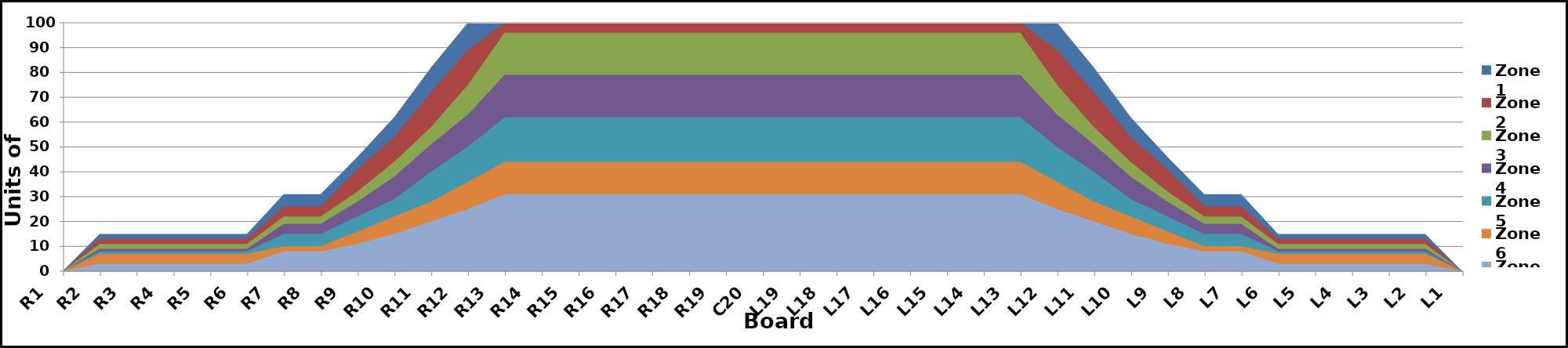
| Category | Zone 1 | Zone 2 | Zone 3 | Zone 4 | Zone 5 | Zone 6 | Zone 7 | Zone 8 |
|---|---|---|---|---|---|---|---|---|
| L1 | 0 | 0 | 0 | 0 | 0 | 0 | 0 | 0 |
| L2 | 15 | 13 | 11 | 9 | 8 | 7 | 3 | 0 |
| L3 | 15 | 13 | 11 | 9 | 8 | 7 | 3 | 0 |
| L4 | 15 | 13 | 11 | 9 | 8 | 7 | 3 | 0 |
| L5 | 15 | 13 | 11 | 9 | 8 | 7 | 3 | 0 |
| L6 | 15 | 13 | 11 | 9 | 8 | 7 | 3 | 0 |
| L7 | 31 | 26 | 22 | 19 | 15 | 10 | 8 | 0 |
| L8 | 31 | 26 | 22 | 19 | 15 | 10 | 8 | 0 |
| L9 | 46 | 41 | 32 | 28 | 22 | 16 | 11 | 0 |
| L10 | 62 | 54 | 44 | 38 | 29 | 22 | 15 | 0 |
| L11 | 82 | 72 | 58 | 51 | 40 | 28 | 20 | 0 |
| L12 | 100 | 89 | 75 | 63 | 50 | 36 | 25 | 0 |
| L13 | 100 | 100 | 96 | 79 | 62 | 44 | 31 | 0 |
| L14 | 100 | 100 | 96 | 79 | 62 | 44 | 31 | 0 |
| L15 | 100 | 100 | 96 | 79 | 62 | 44 | 31 | 0 |
| L16 | 100 | 100 | 96 | 79 | 62 | 44 | 31 | 0 |
| L17 | 100 | 100 | 96 | 79 | 62 | 44 | 31 | 0 |
| L18 | 100 | 100 | 96 | 79 | 62 | 44 | 31 | 0 |
| L19 | 100 | 100 | 96 | 79 | 62 | 44 | 31 | 0 |
| C20 | 100 | 100 | 96 | 79 | 62 | 44 | 31 | 0 |
| R19 | 100 | 100 | 96 | 79 | 62 | 44 | 31 | 0 |
| R18 | 100 | 100 | 96 | 79 | 62 | 44 | 31 | 0 |
| R17 | 100 | 100 | 96 | 79 | 62 | 44 | 31 | 0 |
| R16 | 100 | 100 | 96 | 79 | 62 | 44 | 31 | 0 |
| R15 | 100 | 100 | 96 | 79 | 62 | 44 | 31 | 0 |
| R14 | 100 | 100 | 96 | 79 | 62 | 44 | 31 | 0 |
| R13 | 100 | 100 | 96 | 79 | 62 | 44 | 31 | 0 |
| R12 | 100 | 89 | 75 | 63 | 50 | 36 | 25 | 0 |
| R11 | 82 | 72 | 58 | 51 | 40 | 28 | 20 | 0 |
| R10 | 62 | 54 | 44 | 38 | 29 | 22 | 15 | 0 |
| R9 | 46 | 41 | 32 | 28 | 22 | 16 | 11 | 0 |
| R8 | 31 | 26 | 22 | 19 | 15 | 10 | 8 | 0 |
| R7 | 31 | 26 | 22 | 19 | 15 | 10 | 8 | 0 |
| R6 | 15 | 13 | 11 | 9 | 8 | 7 | 3 | 0 |
| R5 | 15 | 13 | 11 | 9 | 8 | 7 | 3 | 0 |
| R4 | 15 | 13 | 11 | 9 | 8 | 7 | 3 | 0 |
| R3 | 15 | 13 | 11 | 9 | 8 | 7 | 3 | 0 |
| R2 | 15 | 13 | 11 | 9 | 8 | 7 | 3 | 0 |
| R1 | 0 | 0 | 0 | 0 | 0 | 0 | 0 | 0 |